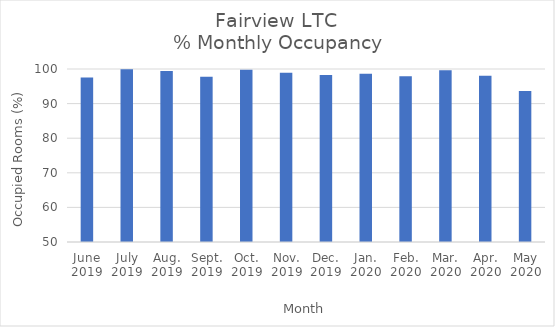
| Category | % Monthly Occupancy |
|---|---|
| June
2019 | 97.54 |
| July
2019 | 99.96 |
| Aug.
2019 | 99.39 |
| Sept.
2019 | 97.74 |
| Oct.
2019 | 99.77 |
| Nov.
2019 | 98.89 |
| Dec.
2019 | 98.27 |
| Jan.
2020 | 98.66 |
| Feb.
2020 | 97.87 |
| Mar.
2020 | 99.65 |
| Apr.
2020 | 98.06 |
| May
2020 | 93.63 |